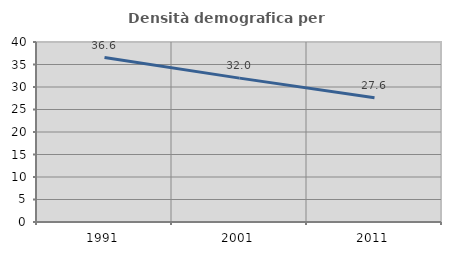
| Category | Densità demografica |
|---|---|
| 1991.0 | 36.553 |
| 2001.0 | 31.975 |
| 2011.0 | 27.597 |